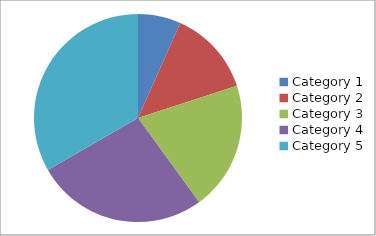
| Category | Series 0 |
|---|---|
| Category 1 | 5 |
| Category 2 | 10 |
| Category 3 | 15 |
| Category 4 | 20 |
| Category 5 | 25 |